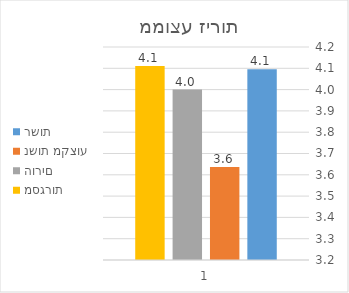
| Category | רשות | נשות מקצוע | הורים | מסגרות |
|---|---|---|---|---|
| 0 | 4.095 | 3.636 | 4 | 4.111 |